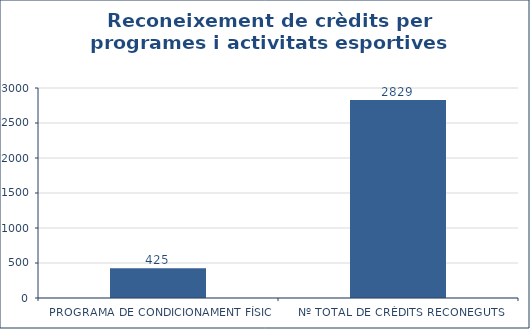
| Category | Series 0 |
|---|---|
| PROGRAMA DE CONDICIONAMENT FÍSIC | 425 |
| Nº TOTAL DE CRÈDITS RECONEGUTS | 2829 |